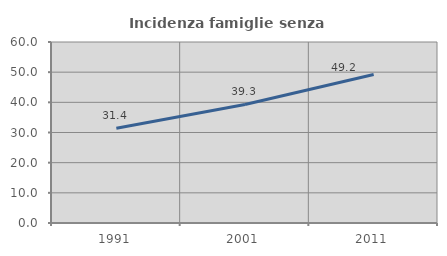
| Category | Incidenza famiglie senza nuclei |
|---|---|
| 1991.0 | 31.387 |
| 2001.0 | 39.289 |
| 2011.0 | 49.239 |